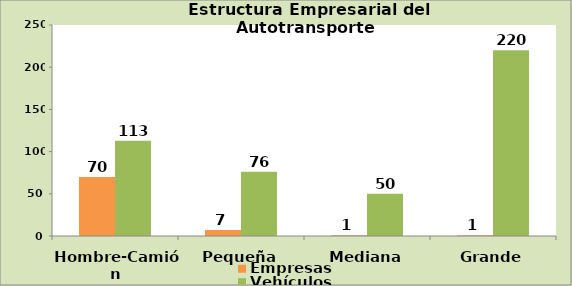
| Category | Empresas | Vehículos |
|---|---|---|
| Hombre-Camión | 70 | 113 |
| Pequeña | 7 | 76 |
| Mediana | 1 | 50 |
| Grande | 1 | 220 |